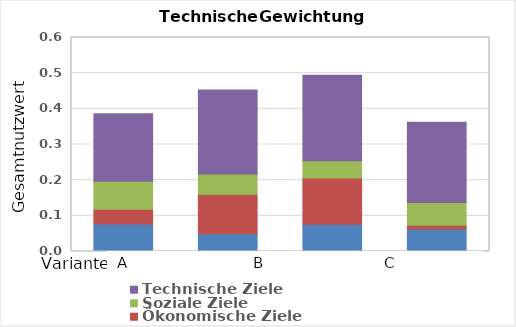
| Category | Umwelt- und Ressourcenschutz | Ökonomische Ziele | Soziale Ziele | Technische Ziele |
|---|---|---|---|---|
| 0 | 0.077 | 0.041 | 0.079 | 0.189 |
| 1 | 0.05 | 0.111 | 0.056 | 0.236 |
| 2 | 0.076 | 0.129 | 0.049 | 0.24 |
| 3 | 0.063 | 0.01 | 0.064 | 0.225 |